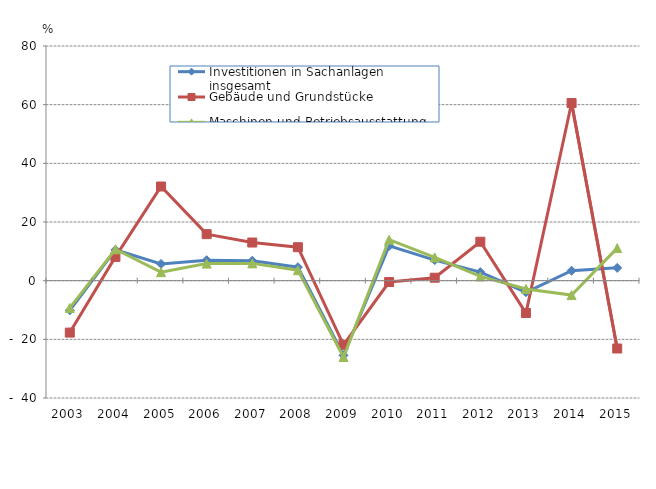
| Category | Investitionen in Sachanlagen insgesamt | Gebäude und Grundstücke | Maschinen und Betriebsausstattung |
|---|---|---|---|
| 2003.0 | -10.1 | -17.7 | -9.3 |
| 2004.0 | 10.5 | 8.1 | 10.7 |
| 2005.0 | 5.7 | 32.1 | 2.9 |
| 2006.0 | 6.991 | 15.857 | 5.812 |
| 2007.0 | 6.796 | 13.004 | 5.891 |
| 2008.0 | 4.6 | 11.4 | 3.579 |
| 2009.0 | -25.44 | -21.879 | -26.027 |
| 2010.0 | 11.843 | -0.455 | 13.982 |
| 2011.0 | 7.019 | 1.003 | 7.933 |
| 2012.0 | 2.918 | 13.273 | 1.446 |
| 2013.0 | -3.946 | -11.028 | -2.822 |
| 2014.0 | 3.39 | 60.554 | -4.916 |
| 2015.0 | 4.363 | -23.122 | 11.106 |